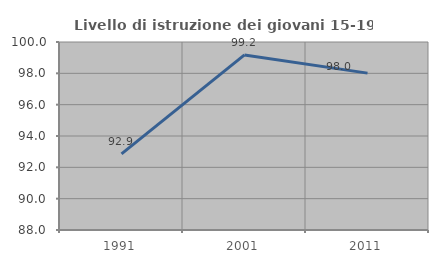
| Category | Livello di istruzione dei giovani 15-19 anni |
|---|---|
| 1991.0 | 92.857 |
| 2001.0 | 99.174 |
| 2011.0 | 98.013 |